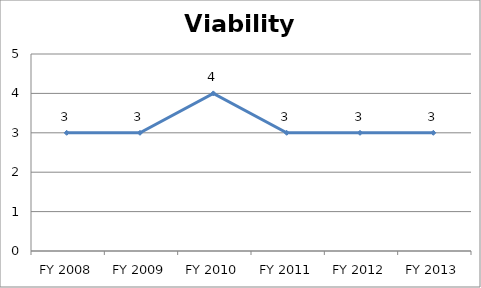
| Category | Viability score |
|---|---|
| FY 2013 | 3 |
| FY 2012 | 3 |
| FY 2011 | 3 |
| FY 2010 | 4 |
| FY 2009 | 3 |
| FY 2008 | 3 |